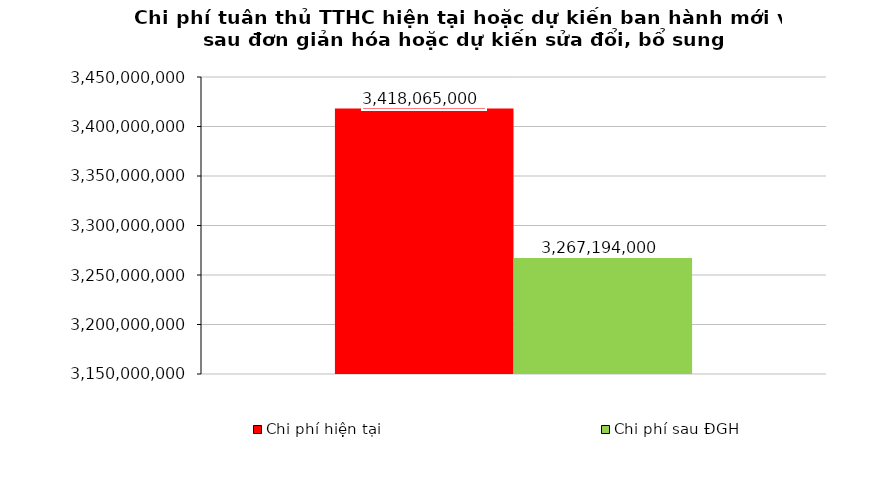
| Category | Chi phí hiện tại | Chi phí sau ĐGH |
|---|---|---|
| 0 | 3418065000 | 3267194000 |